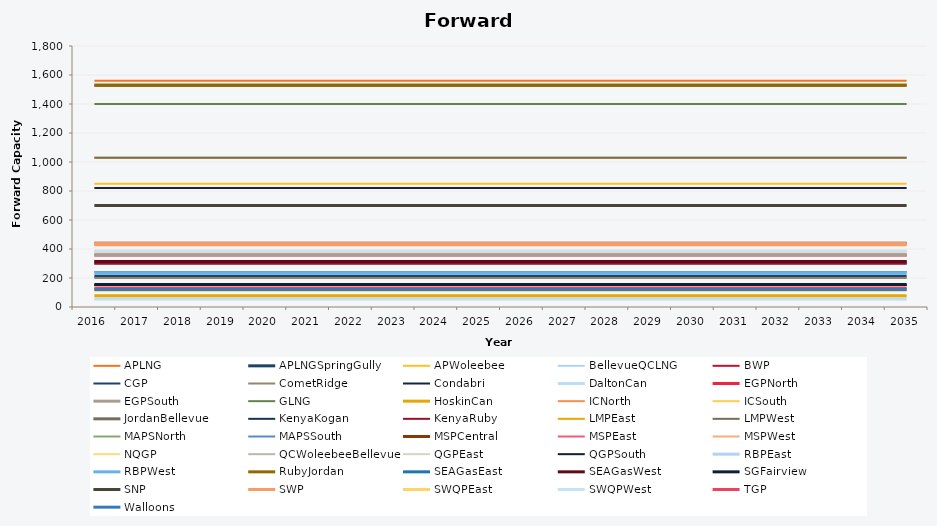
| Category | APLNG | APLNGSpringGully | APWoleebee | BellevueQCLNG | BWP | CGP | CometRidge | Condabri | DaltonCan | EGPNorth | EGPSouth | GLNG | HoskinCan | ICNorth | ICSouth | JordanBellevue | KenyaKogan | KenyaRuby | LMPEast | LMPWest | MAPSNorth | MAPSSouth | MSPCentral | MSPEast | MSPWest | NQGP | QCWoleebeeBellevue | QGPEast | QGPSouth | RBPEast | RBPWest | RubyJordan | SEAGasEast | SEAGasWest | SGFairview | SNP | SWP | SWQPEast | SWQPWest | TGP | Walloons |
|---|---|---|---|---|---|---|---|---|---|---|---|---|---|---|---|---|---|---|---|---|---|---|---|---|---|---|---|---|---|---|---|---|---|---|---|---|---|---|---|---|---|
| 2016.0 | 1560 | 210 | 850 | 1530 | 150 | 119 | 200 | 820 | 56 | 358 | 358 | 1400 | 77 | 120 | 120 | 1530 | 300 | 300 | 1030 | 1030 | 241 | 241 | 439 | 439 | 439 | 110 | 1530 | 151 | 151 | 233 | 233 | 1530 | 314 | 314 | 155 | 700 | 429 | 384 | 384 | 130 | 120 |
| 2017.0 | 1560 | 210 | 850 | 1530 | 150 | 119 | 200 | 820 | 56 | 358 | 358 | 1400 | 77 | 120 | 120 | 1530 | 300 | 300 | 1030 | 1030 | 241 | 241 | 439 | 439 | 439 | 110 | 1530 | 151 | 151 | 233 | 233 | 1530 | 314 | 314 | 155 | 700 | 429 | 384 | 384 | 130 | 120 |
| 2018.0 | 1560 | 210 | 850 | 1530 | 150 | 119 | 200 | 820 | 56 | 358 | 358 | 1400 | 77 | 120 | 120 | 1530 | 300 | 300 | 1030 | 1030 | 241 | 241 | 439 | 439 | 439 | 110 | 1530 | 151 | 151 | 233 | 233 | 1530 | 314 | 314 | 155 | 700 | 429 | 384 | 384 | 130 | 120 |
| 2019.0 | 1560 | 210 | 850 | 1530 | 150 | 119 | 200 | 820 | 56 | 358 | 358 | 1400 | 77 | 120 | 120 | 1530 | 300 | 300 | 1030 | 1030 | 241 | 241 | 439 | 439 | 439 | 110 | 1530 | 151 | 151 | 233 | 233 | 1530 | 314 | 314 | 155 | 700 | 429 | 384 | 384 | 130 | 120 |
| 2020.0 | 1560 | 210 | 850 | 1530 | 150 | 119 | 200 | 820 | 56 | 358 | 358 | 1400 | 77 | 120 | 120 | 1530 | 300 | 300 | 1030 | 1030 | 241 | 241 | 439 | 439 | 439 | 110 | 1530 | 151 | 151 | 233 | 233 | 1530 | 314 | 314 | 155 | 700 | 429 | 384 | 384 | 130 | 120 |
| 2021.0 | 1560 | 210 | 850 | 1530 | 150 | 119 | 200 | 820 | 56 | 358 | 358 | 1400 | 77 | 120 | 120 | 1530 | 300 | 300 | 1030 | 1030 | 241 | 241 | 439 | 439 | 439 | 110 | 1530 | 151 | 151 | 233 | 233 | 1530 | 314 | 314 | 155 | 700 | 429 | 384 | 384 | 130 | 120 |
| 2022.0 | 1560 | 210 | 850 | 1530 | 150 | 119 | 200 | 820 | 56 | 358 | 358 | 1400 | 77 | 120 | 120 | 1530 | 300 | 300 | 1030 | 1030 | 241 | 241 | 439 | 439 | 439 | 110 | 1530 | 151 | 151 | 233 | 233 | 1530 | 314 | 314 | 155 | 700 | 429 | 384 | 384 | 130 | 120 |
| 2023.0 | 1560 | 210 | 850 | 1530 | 150 | 119 | 200 | 820 | 56 | 358 | 358 | 1400 | 77 | 120 | 120 | 1530 | 300 | 300 | 1030 | 1030 | 241 | 241 | 439 | 439 | 439 | 110 | 1530 | 151 | 151 | 233 | 233 | 1530 | 314 | 314 | 155 | 700 | 429 | 384 | 384 | 130 | 120 |
| 2024.0 | 1560 | 210 | 850 | 1530 | 150 | 119 | 200 | 820 | 56 | 358 | 358 | 1400 | 77 | 120 | 120 | 1530 | 300 | 300 | 1030 | 1030 | 241 | 241 | 439 | 439 | 439 | 110 | 1530 | 151 | 151 | 233 | 233 | 1530 | 314 | 314 | 155 | 700 | 429 | 384 | 384 | 130 | 120 |
| 2025.0 | 1560 | 210 | 850 | 1530 | 150 | 119 | 200 | 820 | 56 | 358 | 358 | 1400 | 77 | 120 | 120 | 1530 | 300 | 300 | 1030 | 1030 | 241 | 241 | 439 | 439 | 439 | 110 | 1530 | 151 | 151 | 233 | 233 | 1530 | 314 | 314 | 155 | 700 | 429 | 384 | 384 | 130 | 120 |
| 2026.0 | 1560 | 210 | 850 | 1530 | 150 | 119 | 200 | 820 | 56 | 358 | 358 | 1400 | 77 | 120 | 120 | 1530 | 300 | 300 | 1030 | 1030 | 241 | 241 | 439 | 439 | 439 | 110 | 1530 | 151 | 151 | 233 | 233 | 1530 | 314 | 314 | 155 | 700 | 429 | 384 | 384 | 130 | 120 |
| 2027.0 | 1560 | 210 | 850 | 1530 | 150 | 119 | 200 | 820 | 56 | 358 | 358 | 1400 | 77 | 120 | 120 | 1530 | 300 | 300 | 1030 | 1030 | 241 | 241 | 439 | 439 | 439 | 110 | 1530 | 151 | 151 | 233 | 233 | 1530 | 314 | 314 | 155 | 700 | 429 | 384 | 384 | 130 | 120 |
| 2028.0 | 1560 | 210 | 850 | 1530 | 150 | 119 | 200 | 820 | 56 | 358 | 358 | 1400 | 77 | 120 | 120 | 1530 | 300 | 300 | 1030 | 1030 | 241 | 241 | 439 | 439 | 439 | 110 | 1530 | 151 | 151 | 233 | 233 | 1530 | 314 | 314 | 155 | 700 | 429 | 384 | 384 | 130 | 120 |
| 2029.0 | 1560 | 210 | 850 | 1530 | 150 | 119 | 200 | 820 | 56 | 358 | 358 | 1400 | 77 | 120 | 120 | 1530 | 300 | 300 | 1030 | 1030 | 241 | 241 | 439 | 439 | 439 | 110 | 1530 | 151 | 151 | 233 | 233 | 1530 | 314 | 314 | 155 | 700 | 429 | 384 | 384 | 130 | 120 |
| 2030.0 | 1560 | 210 | 850 | 1530 | 150 | 119 | 200 | 820 | 56 | 358 | 358 | 1400 | 77 | 120 | 120 | 1530 | 300 | 300 | 1030 | 1030 | 241 | 241 | 439 | 439 | 439 | 110 | 1530 | 151 | 151 | 233 | 233 | 1530 | 314 | 314 | 155 | 700 | 429 | 384 | 384 | 130 | 120 |
| 2031.0 | 1560 | 210 | 850 | 1530 | 150 | 119 | 200 | 820 | 56 | 358 | 358 | 1400 | 77 | 120 | 120 | 1530 | 300 | 300 | 1030 | 1030 | 241 | 241 | 439 | 439 | 439 | 110 | 1530 | 151 | 151 | 233 | 233 | 1530 | 314 | 314 | 155 | 700 | 429 | 384 | 384 | 130 | 120 |
| 2032.0 | 1560 | 210 | 850 | 1530 | 150 | 119 | 200 | 820 | 56 | 358 | 358 | 1400 | 77 | 120 | 120 | 1530 | 300 | 300 | 1030 | 1030 | 241 | 241 | 439 | 439 | 439 | 110 | 1530 | 151 | 151 | 233 | 233 | 1530 | 314 | 314 | 155 | 700 | 429 | 384 | 384 | 130 | 120 |
| 2033.0 | 1560 | 210 | 850 | 1530 | 150 | 119 | 200 | 820 | 56 | 358 | 358 | 1400 | 77 | 120 | 120 | 1530 | 300 | 300 | 1030 | 1030 | 241 | 241 | 439 | 439 | 439 | 110 | 1530 | 151 | 151 | 233 | 233 | 1530 | 314 | 314 | 155 | 700 | 429 | 384 | 384 | 130 | 120 |
| 2034.0 | 1560 | 210 | 850 | 1530 | 150 | 119 | 200 | 820 | 56 | 358 | 358 | 1400 | 77 | 120 | 120 | 1530 | 300 | 300 | 1030 | 1030 | 241 | 241 | 439 | 439 | 439 | 110 | 1530 | 151 | 151 | 233 | 233 | 1530 | 314 | 314 | 155 | 700 | 429 | 384 | 384 | 130 | 120 |
| 2035.0 | 1560 | 210 | 850 | 1530 | 150 | 119 | 200 | 820 | 56 | 358 | 358 | 1400 | 77 | 120 | 120 | 1530 | 300 | 300 | 1030 | 1030 | 241 | 241 | 439 | 439 | 439 | 110 | 1530 | 151 | 151 | 233 | 233 | 1530 | 314 | 314 | 155 | 700 | 429 | 384 | 384 | 130 | 120 |